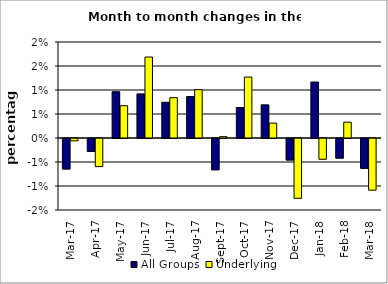
| Category | All Groups | Underlying |
|---|---|---|
| 2017-03-01 | -0.006 | 0 |
| 2017-04-01 | -0.003 | -0.006 |
| 2017-05-01 | 0.01 | 0.007 |
| 2017-06-01 | 0.009 | 0.017 |
| 2017-07-01 | 0.007 | 0.008 |
| 2017-08-01 | 0.009 | 0.01 |
| 2017-09-01 | -0.007 | 0 |
| 2017-10-01 | 0.006 | 0.013 |
| 2017-11-01 | 0.007 | 0.003 |
| 2017-12-01 | -0.004 | -0.012 |
| 2018-01-01 | 0.012 | -0.004 |
| 2018-02-01 | -0.004 | 0.003 |
| 2018-03-01 | -0.006 | -0.011 |